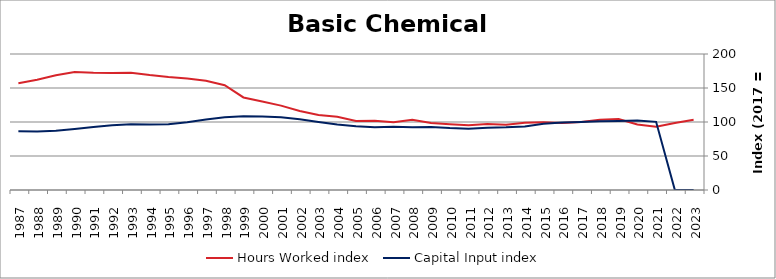
| Category | Hours Worked index | Capital Input index |
|---|---|---|
| 2023.0 | 103.25 | 0 |
| 2022.0 | 98.53 | 0 |
| 2021.0 | 93.134 | 100.253 |
| 2020.0 | 96.433 | 102.06 |
| 2019.0 | 104.518 | 101.455 |
| 2018.0 | 103.264 | 101.036 |
| 2017.0 | 100 | 100 |
| 2016.0 | 98.698 | 99.213 |
| 2015.0 | 99.728 | 97.267 |
| 2014.0 | 98.724 | 93.47 |
| 2013.0 | 95.868 | 92.216 |
| 2012.0 | 96.93 | 91.649 |
| 2011.0 | 95.187 | 90.051 |
| 2010.0 | 96.682 | 91.06 |
| 2009.0 | 98.424 | 92.715 |
| 2008.0 | 103.133 | 92.326 |
| 2007.0 | 99.695 | 93.045 |
| 2006.0 | 101.721 | 92.289 |
| 2005.0 | 101.526 | 93.706 |
| 2004.0 | 107.663 | 96.258 |
| 2003.0 | 110.459 | 99.899 |
| 2002.0 | 116.121 | 104.033 |
| 2001.0 | 124.079 | 106.818 |
| 2000.0 | 130.039 | 108.055 |
| 1999.0 | 136.102 | 108.29 |
| 1998.0 | 153.999 | 106.929 |
| 1997.0 | 160.594 | 103.56 |
| 1996.0 | 163.868 | 99.761 |
| 1995.0 | 166.094 | 96.673 |
| 1994.0 | 168.95 | 96.293 |
| 1993.0 | 172.535 | 96.579 |
| 1992.0 | 172.125 | 95.123 |
| 1991.0 | 172.318 | 92.699 |
| 1990.0 | 173.686 | 89.661 |
| 1989.0 | 168.661 | 87.101 |
| 1988.0 | 162.229 | 86.016 |
| 1987.0 | 156.921 | 86.397 |